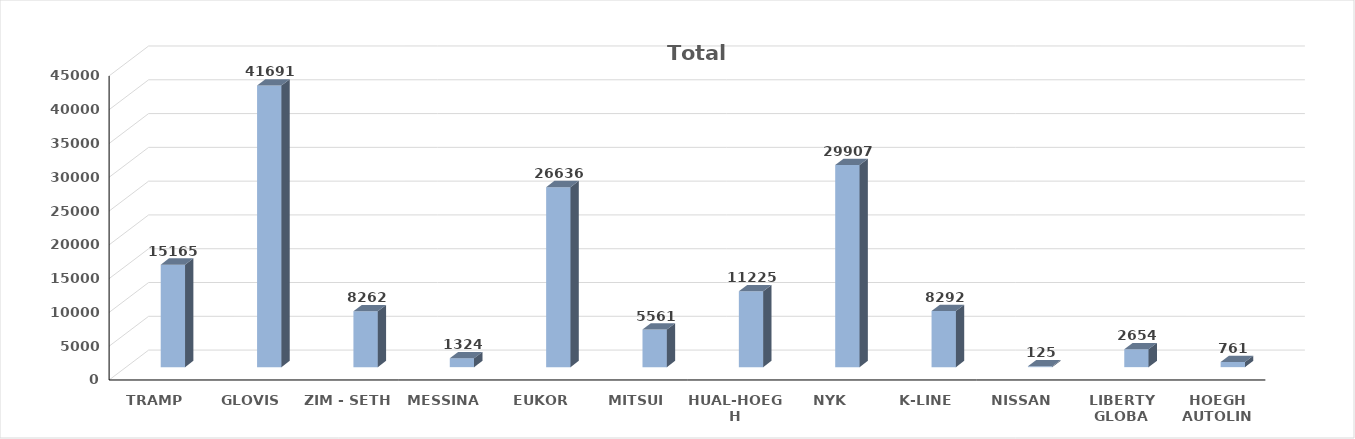
| Category | Series 0 |
|---|---|
| TRAMP | 15165 |
| GLOVIS | 41691 |
| ZIM - SETH | 8262 |
| MESSINA | 1324 |
| EUKOR | 26636 |
| MITSUI | 5561 |
| HUAL-HOEGH | 11225 |
| NYK | 29907 |
| K-LINE | 8292 |
| NISSAN | 125 |
| LIBERTY GLOBA | 2654 |
| HOEGH AUTOLIN | 761 |